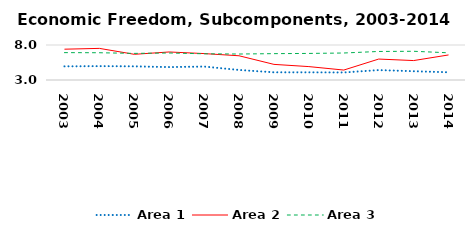
| Category | Area 1 | Area 2 | Area 3 |
|---|---|---|---|
| 2003.0 | 4.95 | 7.4 | 6.91 |
| 2004.0 | 4.982 | 7.518 | 6.895 |
| 2005.0 | 4.952 | 6.671 | 6.801 |
| 2006.0 | 4.846 | 7.004 | 6.858 |
| 2007.0 | 4.92 | 6.774 | 6.745 |
| 2008.0 | 4.436 | 6.461 | 6.711 |
| 2009.0 | 4.099 | 5.23 | 6.765 |
| 2010.0 | 4.097 | 4.914 | 6.796 |
| 2011.0 | 4.075 | 4.42 | 6.856 |
| 2012.0 | 4.418 | 5.991 | 7.077 |
| 2013.0 | 4.254 | 5.775 | 7.103 |
| 2014.0 | 4.103 | 6.58 | 6.886 |